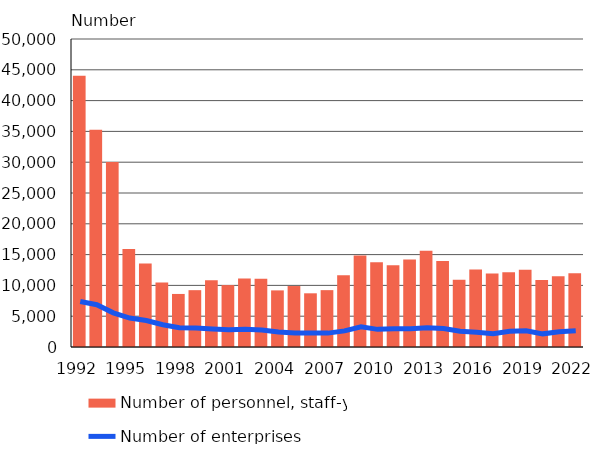
| Category | Number of personnel, staff-years |
|---|---|
| 1992.0 | 44050 |
| 1993.0 | 35282 |
| 1994.0 | 30052 |
| 1995.0 | 15922 |
| 1996.0 | 13551 |
| 1997.0 | 10473 |
| 1998.0 | 8612 |
| 1999.0 | 9226 |
| 2000.0 | 10849 |
| 2001.0 | 10047 |
| 2002.0 | 11126 |
| 2003.0 | 11061 |
| 2004.0 | 9191 |
| 2005.0 | 9898 |
| 2006.0 | 8717 |
| 2007.0 | 9230 |
| 2008.0 | 11660 |
| 2009.0 | 14860 |
| 2010.0 | 13759 |
| 2011.0 | 13270 |
| 2012.0 | 14206 |
| 2013.0 | 15637 |
| 2014.0 | 13951 |
| 2015.0 | 10902 |
| 2016.0 | 12580 |
| 2017.0 | 11943 |
| 2018.0 | 12127 |
| 2019.0 | 12548 |
| 2020.0 | 10876 |
| 2021.0 | 11490 |
| 2022.0 | 11975 |